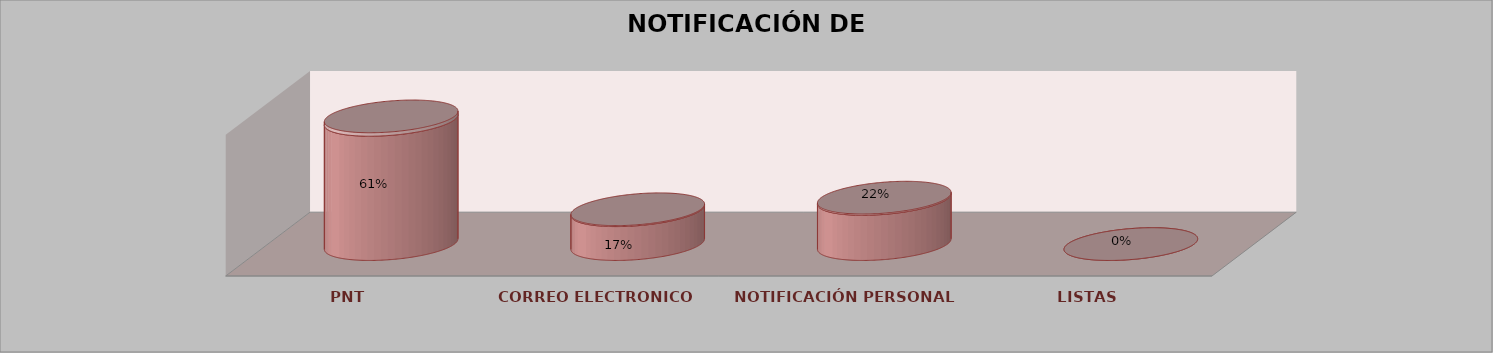
| Category | Series 0 | Series 1 | Series 2 | Series 3 | Series 4 |
|---|---|---|---|---|---|
| PNT |  |  |  | 22 | 0.611 |
| CORREO ELECTRONICO |  |  |  | 6 | 0.167 |
| NOTIFICACIÓN PERSONAL |  |  |  | 8 | 0.222 |
| LISTAS |  |  |  | 0 | 0 |